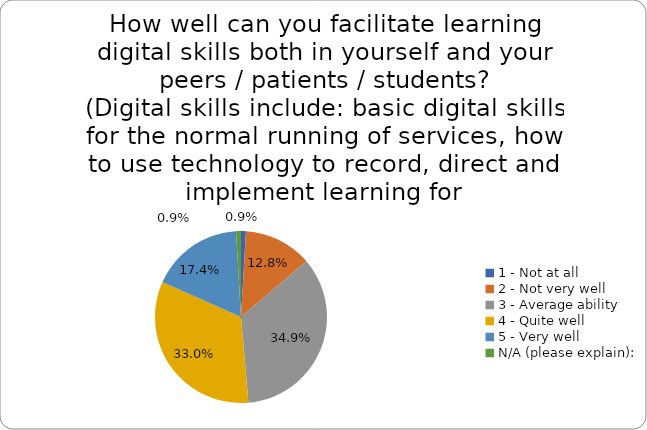
| Category | Series 0 |
|---|---|
| 1 - Not at all | 0.009 |
| 2 - Not very well | 0.128 |
| 3 - Average ability | 0.349 |
| 4 - Quite well | 0.33 |
| 5 - Very well | 0.174 |
| N/A (please explain): | 0.009 |